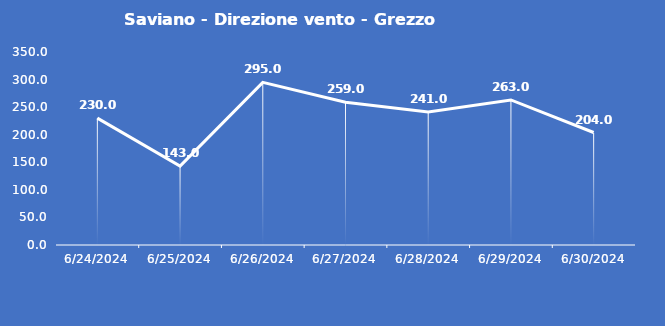
| Category | Saviano - Direzione vento - Grezzo (°N) |
|---|---|
| 6/24/24 | 230 |
| 6/25/24 | 143 |
| 6/26/24 | 295 |
| 6/27/24 | 259 |
| 6/28/24 | 241 |
| 6/29/24 | 263 |
| 6/30/24 | 204 |